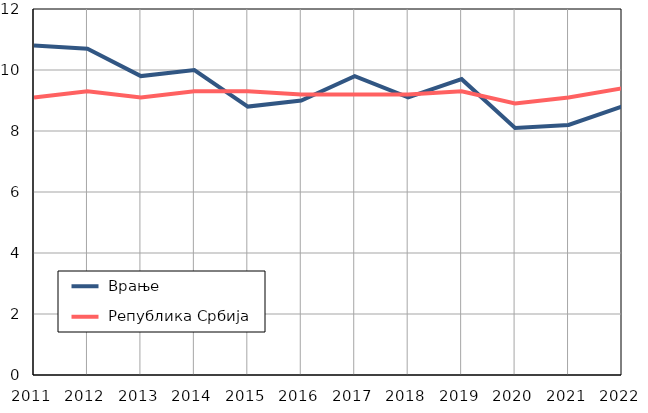
| Category |  Врање |  Република Србија |
|---|---|---|
| 2011.0 | 10.8 | 9.1 |
| 2012.0 | 10.7 | 9.3 |
| 2013.0 | 9.8 | 9.1 |
| 2014.0 | 10 | 9.3 |
| 2015.0 | 8.8 | 9.3 |
| 2016.0 | 9 | 9.2 |
| 2017.0 | 9.8 | 9.2 |
| 2018.0 | 9.1 | 9.2 |
| 2019.0 | 9.7 | 9.3 |
| 2020.0 | 8.1 | 8.9 |
| 2021.0 | 8.2 | 9.1 |
| 2022.0 | 8.8 | 9.4 |